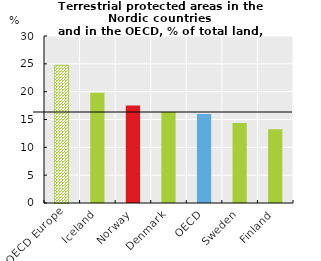
| Category | Series 0 |
|---|---|
| OECD Europe | 24.732 |
| Iceland | 19.807 |
| Norway | 17.498 |
| Denmark | 16.325 |
| OECD | 15.982 |
| Sweden | 14.358 |
| Finland | 13.251 |